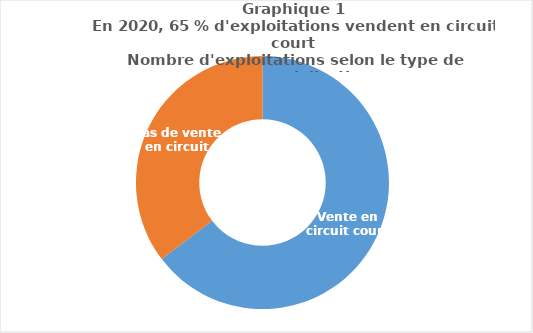
| Category | Series 0 |
|---|---|
| Vente en circuit court | 1732 |
| Pas de vente en circuit court | 947 |